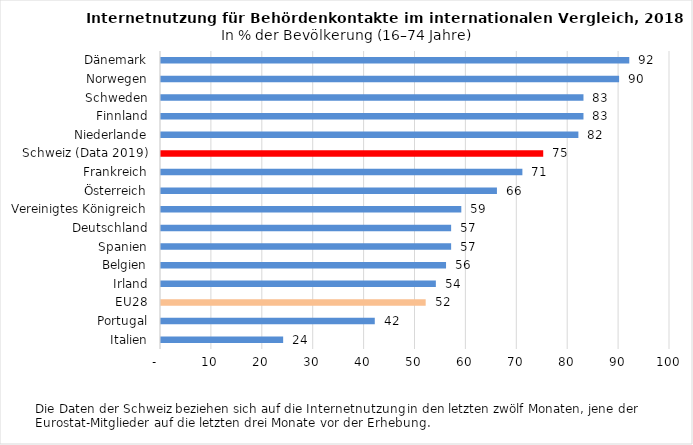
| Category | Series 0 |
|---|---|
| Italien | 24 |
| Portugal | 42 |
| EU28 | 52 |
| Irland | 54 |
| Belgien | 56 |
| Spanien | 57 |
| Deutschland | 57 |
| Vereinigtes Königreich | 59 |
| Österreich | 66 |
| Frankreich | 71 |
| Schweiz (Data 2019) | 75.093 |
| Niederlande | 82 |
| Finnland | 83 |
| Schweden | 83 |
| Norwegen | 90 |
| Dänemark | 92 |